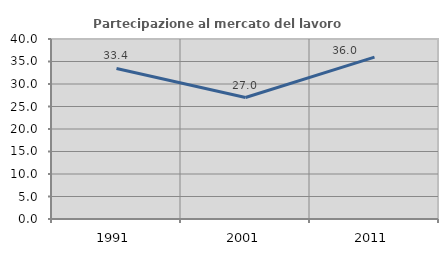
| Category | Partecipazione al mercato del lavoro  femminile |
|---|---|
| 1991.0 | 33.449 |
| 2001.0 | 26.996 |
| 2011.0 | 35.983 |